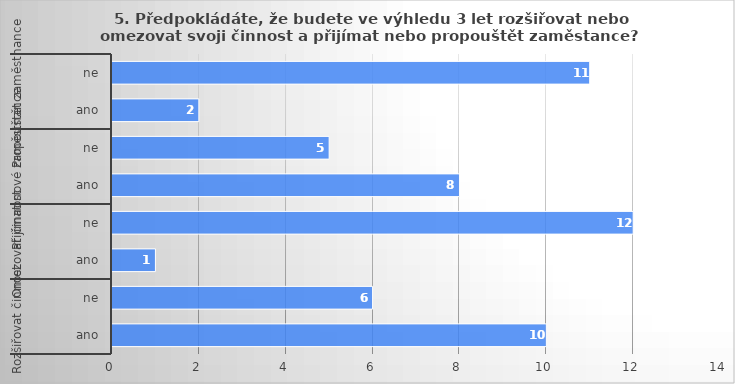
| Category | Series 0 |
|---|---|
| 0 | 10 |
| 1 | 6 |
| 2 | 1 |
| 3 | 12 |
| 4 | 8 |
| 5 | 5 |
| 6 | 2 |
| 7 | 11 |